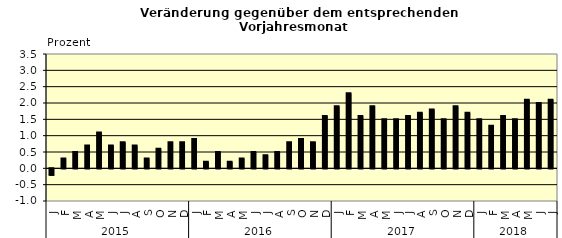
| Category | Series 0 |
|---|---|
| 0 | -0.2 |
| 1 | 0.3 |
| 2 | 0.5 |
| 3 | 0.7 |
| 4 | 1.1 |
| 5 | 0.7 |
| 6 | 0.8 |
| 7 | 0.7 |
| 8 | 0.3 |
| 9 | 0.6 |
| 10 | 0.8 |
| 11 | 0.8 |
| 12 | 0.9 |
| 13 | 0.2 |
| 14 | 0.5 |
| 15 | 0.2 |
| 16 | 0.3 |
| 17 | 0.5 |
| 18 | 0.4 |
| 19 | 0.5 |
| 20 | 0.8 |
| 21 | 0.9 |
| 22 | 0.8 |
| 23 | 1.6 |
| 24 | 1.9 |
| 25 | 2.3 |
| 26 | 1.6 |
| 27 | 1.9 |
| 28 | 1.5 |
| 29 | 1.5 |
| 30 | 1.6 |
| 31 | 1.7 |
| 32 | 1.8 |
| 33 | 1.5 |
| 34 | 1.9 |
| 35 | 1.7 |
| 36 | 1.5 |
| 37 | 1.3 |
| 38 | 1.6 |
| 39 | 1.5 |
| 40 | 2.1 |
| 41 | 2 |
| 42 | 2.1 |